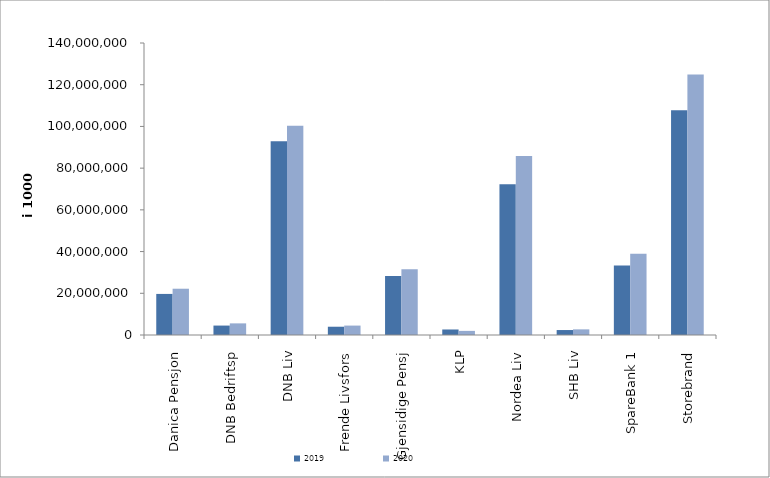
| Category | 2019 | 2020 |
|---|---|---|
| Danica Pensjon | 19693741.599 | 22186843.857 |
| DNB Bedriftsp | 4520776 | 5573307 |
| DNB Liv | 92856889.727 | 100331927.579 |
| Frende Livsfors | 3966911.3 | 4512931 |
| Gjensidige Pensj | 28289547 | 31528930 |
| KLP | 2644541.49 | 1974716.568 |
| Nordea Liv | 72267840 | 85871420 |
| SHB Liv | 2377643.924 | 2702258.381 |
| SpareBank 1 | 33369795.947 | 38969813 |
| Storebrand | 107697369.89 | 124862260.386 |